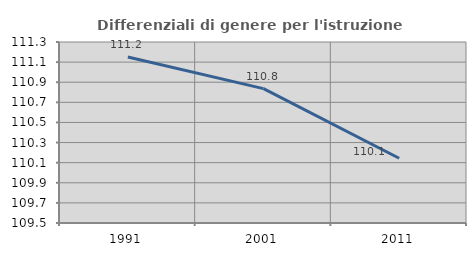
| Category | Differenziali di genere per l'istruzione superiore |
|---|---|
| 1991.0 | 111.151 |
| 2001.0 | 110.837 |
| 2011.0 | 110.144 |